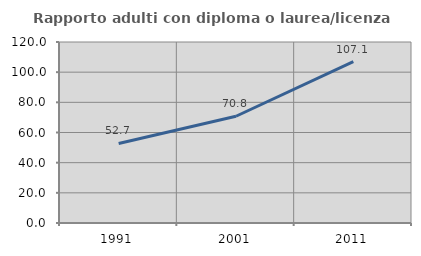
| Category | Rapporto adulti con diploma o laurea/licenza media  |
|---|---|
| 1991.0 | 52.709 |
| 2001.0 | 70.769 |
| 2011.0 | 107.057 |